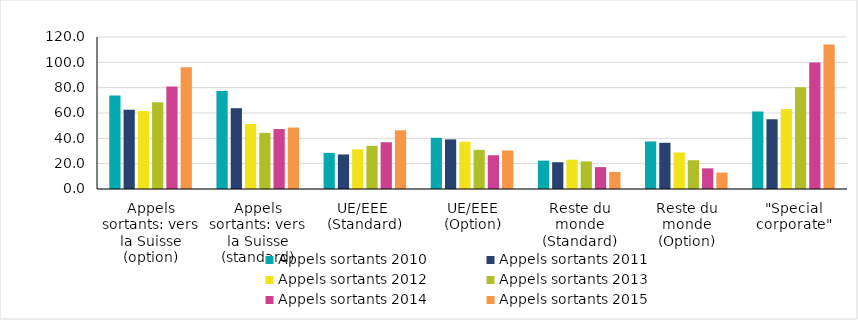
| Category | Appels sortants 2010 | Appels sortants 2011 | Appels sortants 2012 | Appels sortants 2013 | Appels sortants 2014 | Appels sortants 2015 |
|---|---|---|---|---|---|---|
| Appels sortants: vers la Suisse (option) | 73.774 | 62.591 | 61.599 | 68.448 | 80.885 | 96.073 |
| Appels sortants: vers la Suisse (standard) | 77.326 | 63.793 | 51.308 | 44.329 | 47.316 | 48.507 |
| UE/EEE  (Standard) | 28.543 | 27.257 | 31.313 | 34.06 | 36.916 | 46.323 |
| UE/EEE (Option) | 40.383 | 39.164 | 37.376 | 30.894 | 26.656 | 30.41 |
| Reste du monde (Standard) | 22.414 | 21.149 | 23.121 | 21.799 | 17.282 | 13.47 |
| Reste du monde (Option) | 37.53 | 36.482 | 28.821 | 22.713 | 16.304 | 12.94 |
| "Special corporate" | 61.188 | 55.062 | 63.073 | 80.293 | 99.813 | 114.141 |